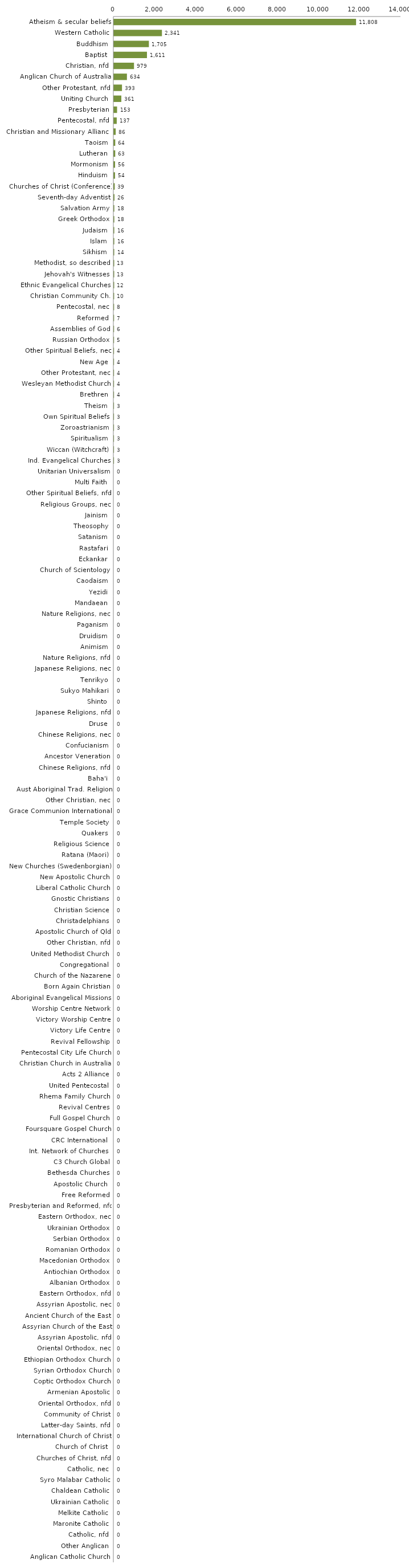
| Category | Series 0 |
|---|---|
| Atheism & secular beliefs | 11808 |
| Western Catholic | 2341 |
| Buddhism | 1705 |
| Baptist | 1611 |
| Christian, nfd | 979 |
| Anglican Church of Australia | 634 |
| Other Protestant, nfd | 393 |
| Uniting Church | 361 |
| Presbyterian | 153 |
| Pentecostal, nfd | 137 |
| Christian and Missionary Alliance | 86 |
| Taoism | 64 |
| Lutheran | 63 |
| Mormonism | 56 |
| Hinduism | 54 |
| Churches of Christ (Conference) | 39 |
| Seventh-day Adventist | 26 |
| Salvation Army | 18 |
| Greek Orthodox | 18 |
| Judaism | 16 |
| Islam | 16 |
| Sikhism | 14 |
| Methodist, so described | 13 |
| Jehovah's Witnesses | 13 |
| Ethnic Evangelical Churches | 12 |
| Christian Community Ch. | 10 |
| Pentecostal, nec | 8 |
| Reformed | 7 |
| Assemblies of God | 6 |
| Russian Orthodox | 5 |
| Other Spiritual Beliefs, nec | 4 |
| New Age | 4 |
| Other Protestant, nec | 4 |
| Wesleyan Methodist Church | 4 |
| Brethren | 4 |
| Theism | 3 |
| Own Spiritual Beliefs | 3 |
| Zoroastrianism | 3 |
| Spiritualism | 3 |
| Wiccan (Witchcraft) | 3 |
| Ind. Evangelical Churches | 3 |
| Unitarian Universalism | 0 |
| Multi Faith | 0 |
| Other Spiritual Beliefs, nfd | 0 |
| Religious Groups, nec | 0 |
| Jainism | 0 |
| Theosophy | 0 |
| Satanism | 0 |
| Rastafari | 0 |
| Eckankar | 0 |
| Church of Scientology | 0 |
| Caodaism | 0 |
| Yezidi | 0 |
| Mandaean | 0 |
| Nature Religions, nec | 0 |
| Paganism | 0 |
| Druidism | 0 |
| Animism | 0 |
| Nature Religions, nfd | 0 |
| Japanese Religions, nec | 0 |
| Tenrikyo | 0 |
| Sukyo Mahikari | 0 |
| Shinto | 0 |
| Japanese Religions, nfd | 0 |
| Druse | 0 |
| Chinese Religions, nec | 0 |
| Confucianism | 0 |
| Ancestor Veneration | 0 |
| Chinese Religions, nfd | 0 |
| Baha'i | 0 |
| Aust Aboriginal Trad. Religion | 0 |
| Other Christian, nec | 0 |
| Grace Communion International | 0 |
| Temple Society | 0 |
| Quakers | 0 |
| Religious Science | 0 |
| Ratana (Maori) | 0 |
| New Churches (Swedenborgian) | 0 |
| New Apostolic Church | 0 |
| Liberal Catholic Church | 0 |
| Gnostic Christians | 0 |
| Christian Science | 0 |
| Christadelphians | 0 |
| Apostolic Church of Qld | 0 |
| Other Christian, nfd | 0 |
| United Methodist Church | 0 |
| Congregational | 0 |
| Church of the Nazarene | 0 |
| Born Again Christian | 0 |
| Aboriginal Evangelical Missions | 0 |
| Worship Centre Network | 0 |
| Victory Worship Centre | 0 |
| Victory Life Centre | 0 |
| Revival Fellowship | 0 |
| Pentecostal City Life Church | 0 |
| Christian Church in Australia | 0 |
| Acts 2 Alliance | 0 |
| United Pentecostal | 0 |
| Rhema Family Church | 0 |
| Revival Centres | 0 |
| Full Gospel Church | 0 |
| Foursquare Gospel Church | 0 |
| CRC International  | 0 |
| Int. Network of Churches  | 0 |
| C3 Church Global | 0 |
| Bethesda Churches | 0 |
| Apostolic Church  | 0 |
| Free Reformed | 0 |
| Presbyterian and Reformed, nfd | 0 |
| Eastern Orthodox, nec | 0 |
| Ukrainian Orthodox | 0 |
| Serbian Orthodox | 0 |
| Romanian Orthodox | 0 |
| Macedonian Orthodox | 0 |
| Antiochian Orthodox | 0 |
| Albanian Orthodox | 0 |
| Eastern Orthodox, nfd | 0 |
| Assyrian Apostolic, nec | 0 |
| Ancient Church of the East | 0 |
| Assyrian Church of the East | 0 |
| Assyrian Apostolic, nfd | 0 |
| Oriental Orthodox, nec | 0 |
| Ethiopian Orthodox Church | 0 |
| Syrian Orthodox Church | 0 |
| Coptic Orthodox Church | 0 |
| Armenian Apostolic | 0 |
| Oriental Orthodox, nfd | 0 |
| Community of Christ | 0 |
| Latter-day Saints, nfd | 0 |
| International Church of Christ | 0 |
| Church of Christ  | 0 |
| Churches of Christ, nfd | 0 |
| Catholic, nec | 0 |
| Syro Malabar Catholic | 0 |
| Chaldean Catholic | 0 |
| Ukrainian Catholic | 0 |
| Melkite Catholic | 0 |
| Maronite Catholic | 0 |
| Catholic, nfd | 0 |
| Other Anglican | 0 |
| Anglican Catholic Church | 0 |